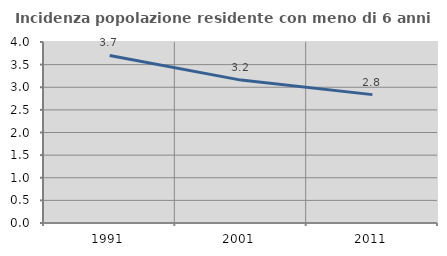
| Category | Incidenza popolazione residente con meno di 6 anni |
|---|---|
| 1991.0 | 3.704 |
| 2001.0 | 3.158 |
| 2011.0 | 2.837 |